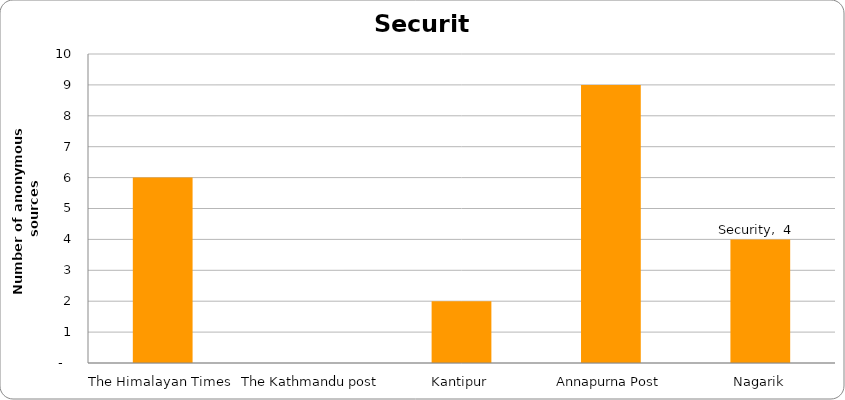
| Category | Security |
|---|---|
| The Himalayan Times | 6 |
| The Kathmandu post | 0 |
| Kantipur | 2 |
| Annapurna Post | 9 |
| Nagarik | 4 |